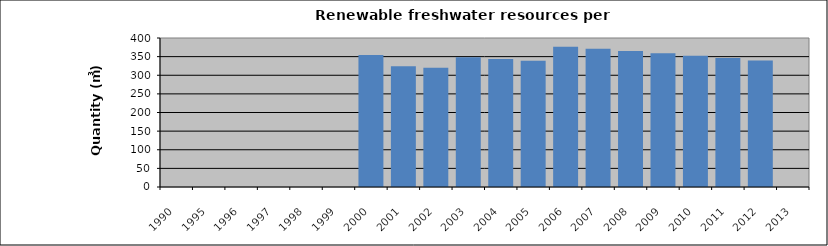
| Category | 1990 1995 1996 1997 1998 1999 2000 2001 2002 2003 2004 2005 2006 2007 2008 2009 2010 2011 2012 2013 |
|---|---|
| 1990.0 | 0 |
| 1995.0 | 0 |
| 1996.0 | 0 |
| 1997.0 | 0 |
| 1998.0 | 0 |
| 1999.0 | 0 |
| 2000.0 | 354.352 |
| 2001.0 | 324.308 |
| 2002.0 | 320.252 |
| 2003.0 | 348.08 |
| 2004.0 | 343.6 |
| 2005.0 | 338.945 |
| 2006.0 | 376.511 |
| 2007.0 | 370.878 |
| 2008.0 | 365.028 |
| 2009.0 | 358.937 |
| 2010.0 | 352.618 |
| 2011.0 | 346.078 |
| 2012.0 | 339.402 |
| 2013.0 | 0 |